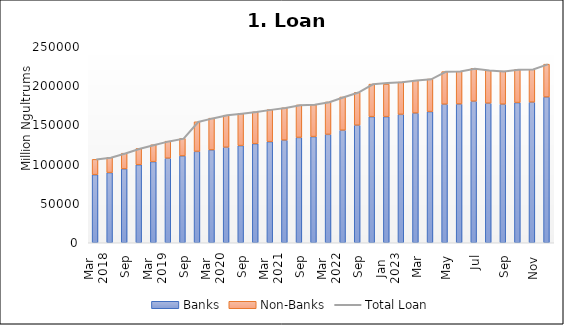
| Category | Banks | Non-Banks |
|---|---|---|
| 0 | 86839.062 | 19536.13 |
| 1 | 89492.789 | 19317.924 |
| 2 | 94257.106 | 19993.763 |
| 3 | 99542.627 | 20696.164 |
| 4 | 103455.022 | 21541.616 |
| 5 | 107823.786 | 21766.128 |
| 6 | 110793.514 | 22289.762 |
| 7 | 116541.685 | 37784.488 |
| 8 | 118433.441 | 40493.857 |
| 9 | 121831.338 | 40869.086 |
| 10 | 123947.936 | 40898.135 |
| 11 | 126363.799 | 40625.692 |
| 12 | 128951.639 | 40851.287 |
| 13 | 130897.833 | 41243.55 |
| 14 | 134359.87 | 41428.68 |
| 15 | 135415.887 | 40793.4 |
| 16 | 138284.661 | 41288.566 |
| 17 | 143532.338 | 42375.24 |
| 18 | 149966.968 | 41992.436 |
| 19 | 160873.72 | 41509.575 |
| 20 | 160873.72 | 41509.575 |
| 21 | 163784.222 | 41233.942 |
| 22 | 165428.061 | 41861.82 |
| 23 | 167303.912 | 41496.685 |
| 24 | 176700.108 | 41607.518 |
| 25 | 176977.708 | 41819.738 |
| 26 | 180513.181 | 41855.293 |
| 27 | 178011.08 | 41903.059 |
| 28 | 176771.277 | 42122.595 |
| 29 | 178802.345 | 42166.639 |
| 30 | 179344.973 | 41882.676 |
| 31 | 185914.645 | 41896.442 |